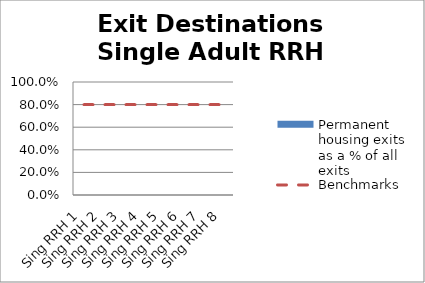
| Category | Permanent housing exits as a % of all exits |
|---|---|
| Sing RRH 1 | 0 |
| Sing RRH 2 | 0 |
| Sing RRH 3 | 0 |
| Sing RRH 4 | 0 |
| Sing RRH 5 | 0 |
| Sing RRH 6 | 0 |
| Sing RRH 7 | 0 |
| Sing RRH 8 | 0 |